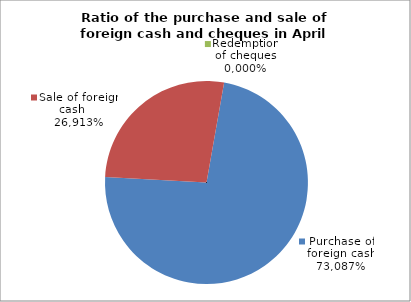
| Category | Purchase of foreign cash |
|---|---|
| 0 | 0.731 |
| 1 | 0.269 |
| 2 | 0 |